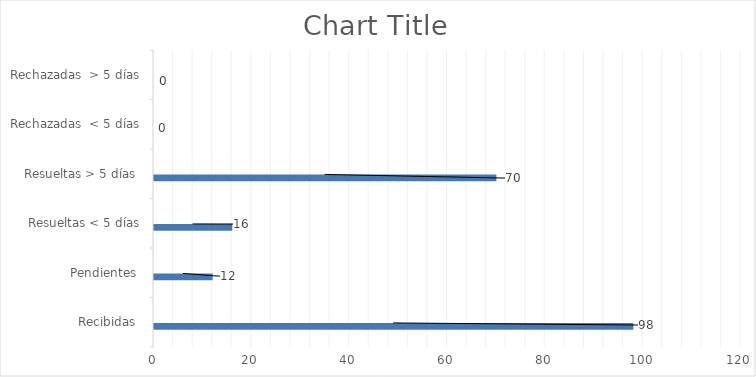
| Category | Física | PORTAL SAIP | 311 | Otras |
|---|---|---|---|---|
| Recibidas  | 0 | 98 | 0 | 0 |
| Pendientes  | 0 | 12 | 0 | 0 |
| Resueltas < 5 días | 0 | 16 | 0 | 0 |
| Resueltas > 5 días  | 0 | 70 | 0 | 0 |
| Rechazadas  < 5 días | 0 | 0 | 0 | 0 |
| Rechazadas  > 5 días | 0 | 0 | 0 | 0 |